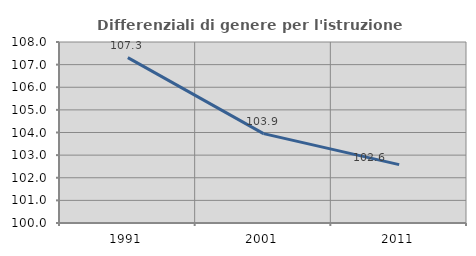
| Category | Differenziali di genere per l'istruzione superiore |
|---|---|
| 1991.0 | 107.309 |
| 2001.0 | 103.949 |
| 2011.0 | 102.578 |